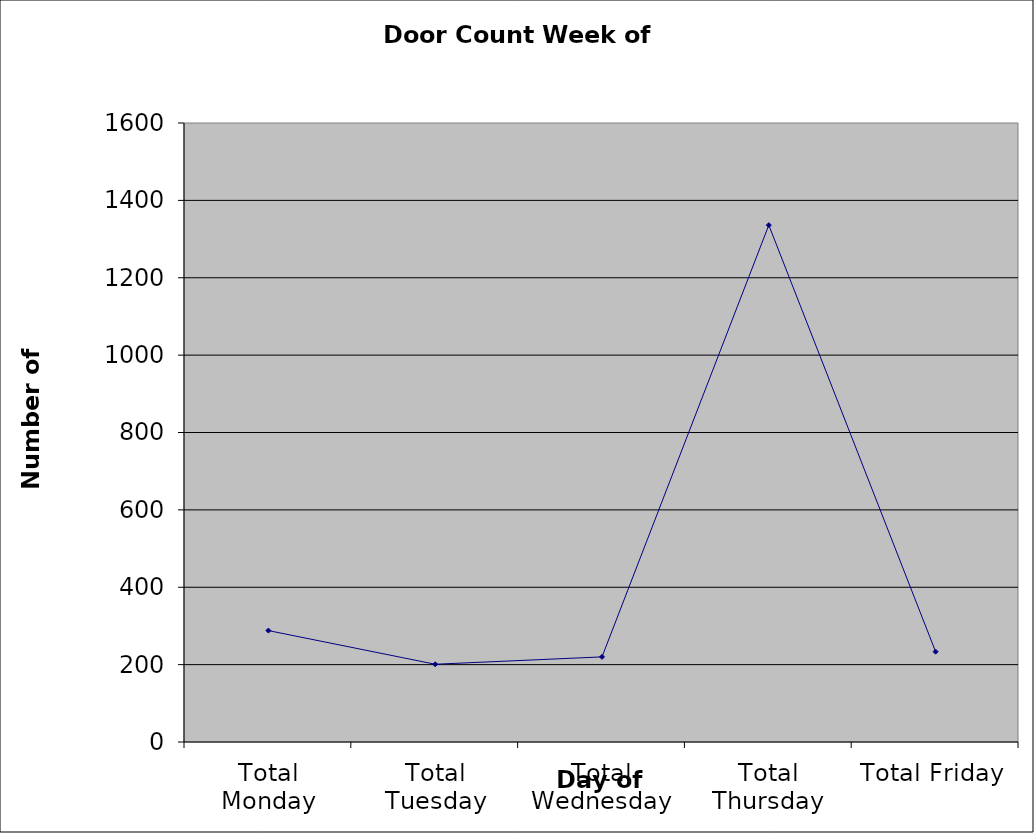
| Category | Series 0 |
|---|---|
| Total Monday | 288 |
| Total Tuesday | 201 |
| Total Wednesday | 220 |
| Total Thursday | 1336 |
| Total Friday | 233.5 |